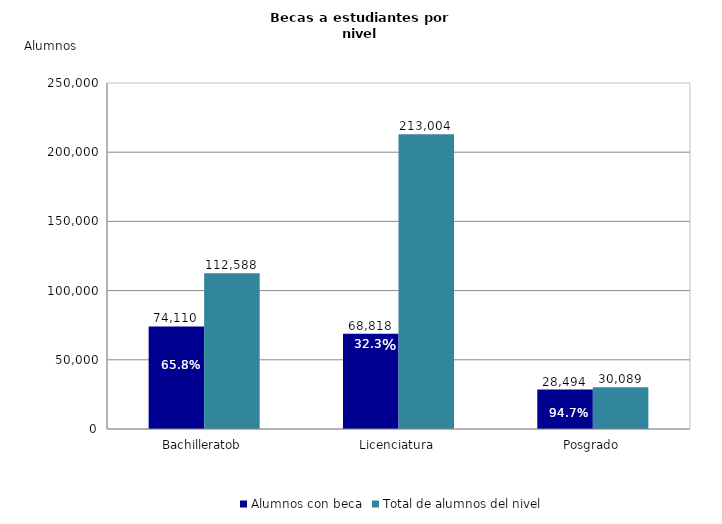
| Category | Alumnos con beca | Total de alumnos del nivel |
|---|---|---|
| Bachilleratob | 74110 | 112588 |
| Licenciatura | 68818 | 213004 |
| Posgrado | 28494 | 30089 |